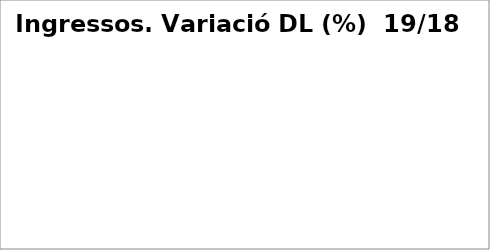
| Category | Series 0 |
|---|---|
| Impostos directes | -0.05 |
| Impostos indirectes | 0.341 |
| Taxes, preus públics i altres ingressos | 0.149 |
| Transferències corrents | -0.02 |
| Ingressos patrimonials | 0.089 |
| Venda d'inversions reals | 1 |
| Transferències de capital | -0.954 |
| Actius financers* | 0 |
| Passius financers | -0.736 |